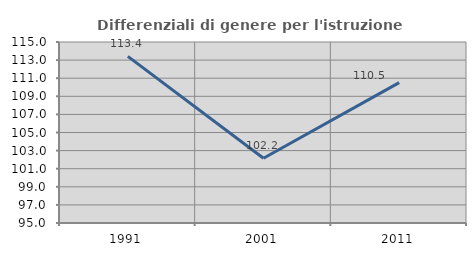
| Category | Differenziali di genere per l'istruzione superiore |
|---|---|
| 1991.0 | 113.414 |
| 2001.0 | 102.157 |
| 2011.0 | 110.505 |